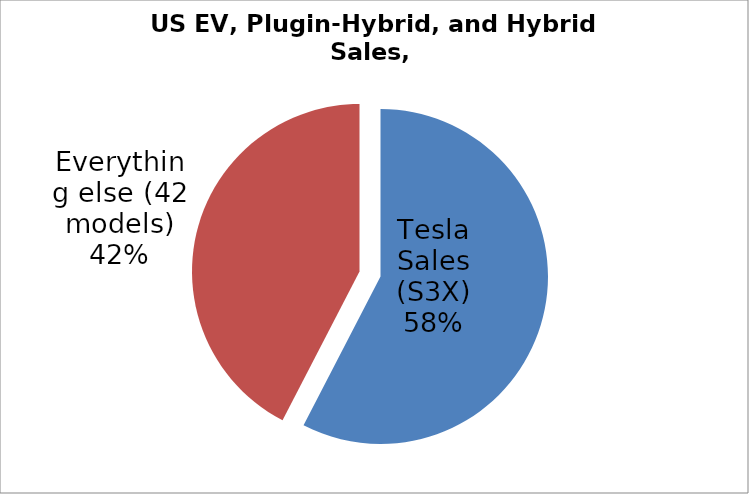
| Category | Series 0 |
|---|---|
| Tesla Sales (S3X) | 16350 |
| Everything else (42 models) | 12036 |